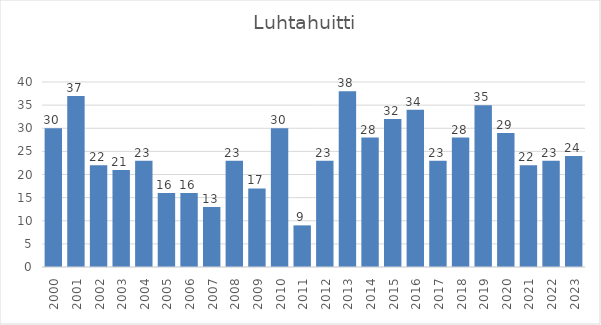
| Category | Series 0 |
|---|---|
| 2000.0 | 30 |
| 2001.0 | 37 |
| 2002.0 | 22 |
| 2003.0 | 21 |
| 2004.0 | 23 |
| 2005.0 | 16 |
| 2006.0 | 16 |
| 2007.0 | 13 |
| 2008.0 | 23 |
| 2009.0 | 17 |
| 2010.0 | 30 |
| 2011.0 | 9 |
| 2012.0 | 23 |
| 2013.0 | 38 |
| 2014.0 | 28 |
| 2015.0 | 32 |
| 2016.0 | 34 |
| 2017.0 | 23 |
| 2018.0 | 28 |
| 2019.0 | 35 |
| 2020.0 | 29 |
| 2021.0 | 22 |
| 2022.0 | 23 |
| 2023.0 | 24 |